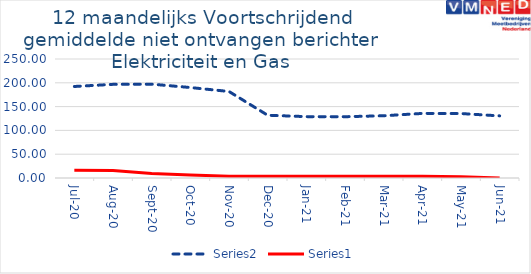
| Category | Series 3 | Series 0 |
|---|---|---|
| 2020-07-01 | 192.25 | 16.25 |
| 2020-08-01 | 196.75 | 15.833 |
| 2020-09-01 | 197.167 | 9.5 |
| 2020-10-01 | 190.083 | 6.417 |
| 2020-11-01 | 181.75 | 3.75 |
| 2020-12-01 | 131.833 | 3.5 |
| 2021-01-01 | 128.917 | 3.75 |
| 2021-02-01 | 128.75 | 3.667 |
| 2021-03-01 | 130.75 | 3.667 |
| 2021-04-01 | 135.667 | 3.667 |
| 2021-05-01 | 135.417 | 2.833 |
| 2021-06-01 | 130.5 | 0.25 |